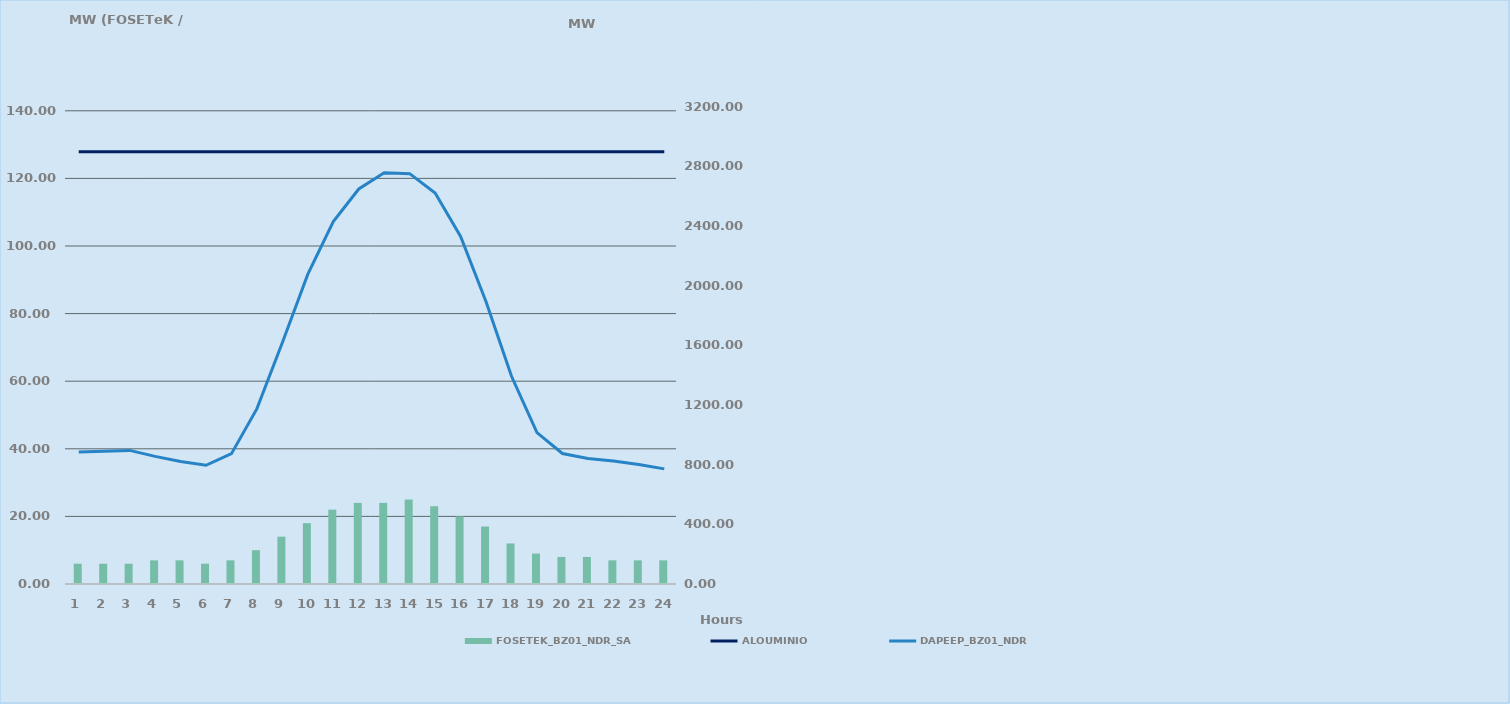
| Category | FOSETEK_BZ01_NDR_SA |
|---|---|
| 0 | 6 |
| 1 | 6 |
| 2 | 6 |
| 3 | 7 |
| 4 | 7 |
| 5 | 6 |
| 6 | 7 |
| 7 | 10 |
| 8 | 14 |
| 9 | 18 |
| 10 | 22 |
| 11 | 24 |
| 12 | 24 |
| 13 | 25 |
| 14 | 23 |
| 15 | 20 |
| 16 | 17 |
| 17 | 12 |
| 18 | 9 |
| 19 | 8 |
| 20 | 8 |
| 21 | 7 |
| 22 | 7 |
| 23 | 7 |